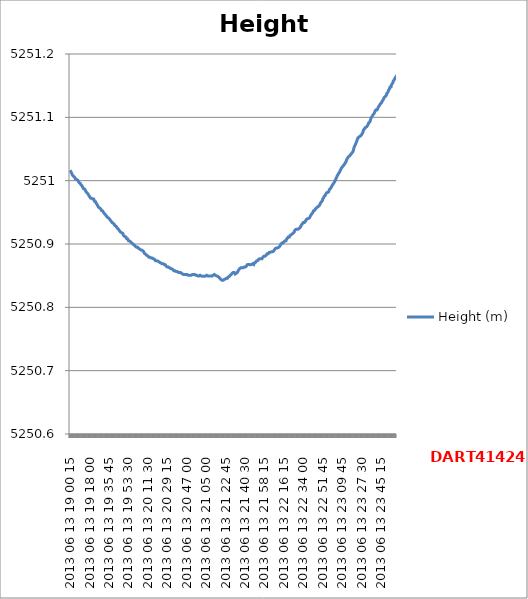
| Category | Height (m) |
|---|---|
| 2013 06 13 19 00 15 | 5251.017 |
| 2013 06 13 19 00 30 | 5251.016 |
| 2013 06 13 19 00 45 | 5251.015 |
| 2013 06 13 19 01 00 | 5251.014 |
| 2013 06 13 19 01 15 | 5251.014 |
| 2013 06 13 19 01 30 | 5251.012 |
| 2013 06 13 19 01 45 | 5251.012 |
| 2013 06 13 19 02 00 | 5251.011 |
| 2013 06 13 19 02 15 | 5251.011 |
| 2013 06 13 19 02 30 | 5251.009 |
| 2013 06 13 19 02 45 | 5251.009 |
| 2013 06 13 19 03 00 | 5251.008 |
| 2013 06 13 19 03 15 | 5251.008 |
| 2013 06 13 19 03 30 | 5251.007 |
| 2013 06 13 19 03 45 | 5251.007 |
| 2013 06 13 19 04 00 | 5251.006 |
| 2013 06 13 19 04 15 | 5251.006 |
| 2013 06 13 19 04 30 | 5251.005 |
| 2013 06 13 19 04 45 | 5251.004 |
| 2013 06 13 19 05 00 | 5251.004 |
| 2013 06 13 19 05 15 | 5251.003 |
| 2013 06 13 19 05 30 | 5251.003 |
| 2013 06 13 19 05 45 | 5251.003 |
| 2013 06 13 19 06 00 | 5251.002 |
| 2013 06 13 19 06 15 | 5251.002 |
| 2013 06 13 19 06 30 | 5251.001 |
| 2013 06 13 19 06 45 | 5251.001 |
| 2013 06 13 19 07 00 | 5251.001 |
| 2013 06 13 19 07 15 | 5251.001 |
| 2013 06 13 19 07 30 | 5251 |
| 2013 06 13 19 07 45 | 5250.999 |
| 2013 06 13 19 08 00 | 5250.999 |
| 2013 06 13 19 08 15 | 5250.998 |
| 2013 06 13 19 08 30 | 5250.997 |
| 2013 06 13 19 08 45 | 5250.997 |
| 2013 06 13 19 09 00 | 5250.996 |
| 2013 06 13 19 09 15 | 5250.996 |
| 2013 06 13 19 09 30 | 5250.996 |
| 2013 06 13 19 09 45 | 5250.995 |
| 2013 06 13 19 10 00 | 5250.994 |
| 2013 06 13 19 10 15 | 5250.993 |
| 2013 06 13 19 10 30 | 5250.993 |
| 2013 06 13 19 10 45 | 5250.993 |
| 2013 06 13 19 11 00 | 5250.992 |
| 2013 06 13 19 11 15 | 5250.991 |
| 2013 06 13 19 11 30 | 5250.99 |
| 2013 06 13 19 11 45 | 5250.99 |
| 2013 06 13 19 12 00 | 5250.99 |
| 2013 06 13 19 12 15 | 5250.99 |
| 2013 06 13 19 12 30 | 5250.988 |
| 2013 06 13 19 12 45 | 5250.988 |
| 2013 06 13 19 13 00 | 5250.988 |
| 2013 06 13 19 13 15 | 5250.987 |
| 2013 06 13 19 13 30 | 5250.987 |
| 2013 06 13 19 13 45 | 5250.986 |
| 2013 06 13 19 14 00 | 5250.986 |
| 2013 06 13 19 14 15 | 5250.985 |
| 2013 06 13 19 14 30 | 5250.984 |
| 2013 06 13 19 14 45 | 5250.983 |
| 2013 06 13 19 15 00 | 5250.983 |
| 2013 06 13 19 15 15 | 5250.983 |
| 2013 06 13 19 15 30 | 5250.982 |
| 2013 06 13 19 15 45 | 5250.981 |
| 2013 06 13 19 16 00 | 5250.98 |
| 2013 06 13 19 16 15 | 5250.98 |
| 2013 06 13 19 16 30 | 5250.98 |
| 2013 06 13 19 16 45 | 5250.979 |
| 2013 06 13 19 17 00 | 5250.978 |
| 2013 06 13 19 17 15 | 5250.977 |
| 2013 06 13 19 17 30 | 5250.976 |
| 2013 06 13 19 17 45 | 5250.976 |
| 2013 06 13 19 18 00 | 5250.975 |
| 2013 06 13 19 18 15 | 5250.975 |
| 2013 06 13 19 18 30 | 5250.974 |
| 2013 06 13 19 18 45 | 5250.973 |
| 2013 06 13 19 19 00 | 5250.974 |
| 2013 06 13 19 19 15 | 5250.973 |
| 2013 06 13 19 19 30 | 5250.973 |
| 2013 06 13 19 19 45 | 5250.972 |
| 2013 06 13 19 20 00 | 5250.971 |
| 2013 06 13 19 20 15 | 5250.972 |
| 2013 06 13 19 20 30 | 5250.971 |
| 2013 06 13 19 20 45 | 5250.971 |
| 2013 06 13 19 21 00 | 5250.971 |
| 2013 06 13 19 21 15 | 5250.97 |
| 2013 06 13 19 21 30 | 5250.97 |
| 2013 06 13 19 21 45 | 5250.971 |
| 2013 06 13 19 22 00 | 5250.97 |
| 2013 06 13 19 22 15 | 5250.969 |
| 2013 06 13 19 22 30 | 5250.968 |
| 2013 06 13 19 22 45 | 5250.968 |
| 2013 06 13 19 23 00 | 5250.968 |
| 2013 06 13 19 23 15 | 5250.967 |
| 2013 06 13 19 23 30 | 5250.967 |
| 2013 06 13 19 23 45 | 5250.966 |
| 2013 06 13 19 24 00 | 5250.965 |
| 2013 06 13 19 24 15 | 5250.964 |
| 2013 06 13 19 24 30 | 5250.964 |
| 2013 06 13 19 24 45 | 5250.963 |
| 2013 06 13 19 25 00 | 5250.963 |
| 2013 06 13 19 25 15 | 5250.961 |
| 2013 06 13 19 25 30 | 5250.961 |
| 2013 06 13 19 25 45 | 5250.96 |
| 2013 06 13 19 26 00 | 5250.96 |
| 2013 06 13 19 26 15 | 5250.958 |
| 2013 06 13 19 26 30 | 5250.959 |
| 2013 06 13 19 26 45 | 5250.958 |
| 2013 06 13 19 27 00 | 5250.957 |
| 2013 06 13 19 27 15 | 5250.957 |
| 2013 06 13 19 27 30 | 5250.957 |
| 2013 06 13 19 27 45 | 5250.956 |
| 2013 06 13 19 28 00 | 5250.956 |
| 2013 06 13 19 28 15 | 5250.955 |
| 2013 06 13 19 28 30 | 5250.955 |
| 2013 06 13 19 28 45 | 5250.954 |
| 2013 06 13 19 29 00 | 5250.953 |
| 2013 06 13 19 29 15 | 5250.952 |
| 2013 06 13 19 29 30 | 5250.952 |
| 2013 06 13 19 29 45 | 5250.952 |
| 2013 06 13 19 30 00 | 5250.952 |
| 2013 06 13 19 30 15 | 5250.951 |
| 2013 06 13 19 30 30 | 5250.951 |
| 2013 06 13 19 30 45 | 5250.95 |
| 2013 06 13 19 31 00 | 5250.95 |
| 2013 06 13 19 31 15 | 5250.95 |
| 2013 06 13 19 31 30 | 5250.948 |
| 2013 06 13 19 31 45 | 5250.949 |
| 2013 06 13 19 32 00 | 5250.948 |
| 2013 06 13 19 32 15 | 5250.948 |
| 2013 06 13 19 32 30 | 5250.947 |
| 2013 06 13 19 32 45 | 5250.947 |
| 2013 06 13 19 33 00 | 5250.946 |
| 2013 06 13 19 33 15 | 5250.945 |
| 2013 06 13 19 33 30 | 5250.945 |
| 2013 06 13 19 33 45 | 5250.944 |
| 2013 06 13 19 34 00 | 5250.943 |
| 2013 06 13 19 34 15 | 5250.943 |
| 2013 06 13 19 34 30 | 5250.943 |
| 2013 06 13 19 34 45 | 5250.942 |
| 2013 06 13 19 35 00 | 5250.942 |
| 2013 06 13 19 35 15 | 5250.942 |
| 2013 06 13 19 35 30 | 5250.941 |
| 2013 06 13 19 35 45 | 5250.941 |
| 2013 06 13 19 36 00 | 5250.94 |
| 2013 06 13 19 36 15 | 5250.939 |
| 2013 06 13 19 36 30 | 5250.939 |
| 2013 06 13 19 36 45 | 5250.939 |
| 2013 06 13 19 37 00 | 5250.938 |
| 2013 06 13 19 37 15 | 5250.937 |
| 2013 06 13 19 37 30 | 5250.937 |
| 2013 06 13 19 37 45 | 5250.936 |
| 2013 06 13 19 38 00 | 5250.935 |
| 2013 06 13 19 38 15 | 5250.935 |
| 2013 06 13 19 38 30 | 5250.934 |
| 2013 06 13 19 38 45 | 5250.934 |
| 2013 06 13 19 39 00 | 5250.934 |
| 2013 06 13 19 39 15 | 5250.933 |
| 2013 06 13 19 39 30 | 5250.933 |
| 2013 06 13 19 39 45 | 5250.932 |
| 2013 06 13 19 40 00 | 5250.932 |
| 2013 06 13 19 40 15 | 5250.932 |
| 2013 06 13 19 40 30 | 5250.931 |
| 2013 06 13 19 40 45 | 5250.931 |
| 2013 06 13 19 41 00 | 5250.93 |
| 2013 06 13 19 41 15 | 5250.929 |
| 2013 06 13 19 41 30 | 5250.929 |
| 2013 06 13 19 41 45 | 5250.929 |
| 2013 06 13 19 42 00 | 5250.929 |
| 2013 06 13 19 42 15 | 5250.928 |
| 2013 06 13 19 42 30 | 5250.928 |
| 2013 06 13 19 42 45 | 5250.927 |
| 2013 06 13 19 43 00 | 5250.927 |
| 2013 06 13 19 43 15 | 5250.926 |
| 2013 06 13 19 43 30 | 5250.926 |
| 2013 06 13 19 43 45 | 5250.925 |
| 2013 06 13 19 44 00 | 5250.925 |
| 2013 06 13 19 44 15 | 5250.924 |
| 2013 06 13 19 44 30 | 5250.923 |
| 2013 06 13 19 44 45 | 5250.923 |
| 2013 06 13 19 45 00 | 5250.922 |
| 2013 06 13 19 45 15 | 5250.922 |
| 2013 06 13 19 45 30 | 5250.921 |
| 2013 06 13 19 45 45 | 5250.921 |
| 2013 06 13 19 46 00 | 5250.92 |
| 2013 06 13 19 46 15 | 5250.919 |
| 2013 06 13 19 46 30 | 5250.919 |
| 2013 06 13 19 46 45 | 5250.919 |
| 2013 06 13 19 47 00 | 5250.918 |
| 2013 06 13 19 47 15 | 5250.918 |
| 2013 06 13 19 47 30 | 5250.917 |
| 2013 06 13 19 47 45 | 5250.917 |
| 2013 06 13 19 48 00 | 5250.917 |
| 2013 06 13 19 48 15 | 5250.917 |
| 2013 06 13 19 48 30 | 5250.916 |
| 2013 06 13 19 48 45 | 5250.915 |
| 2013 06 13 19 49 00 | 5250.914 |
| 2013 06 13 19 49 15 | 5250.913 |
| 2013 06 13 19 49 30 | 5250.914 |
| 2013 06 13 19 49 45 | 5250.913 |
| 2013 06 13 19 50 00 | 5250.913 |
| 2013 06 13 19 50 15 | 5250.912 |
| 2013 06 13 19 50 30 | 5250.912 |
| 2013 06 13 19 50 45 | 5250.911 |
| 2013 06 13 19 51 00 | 5250.911 |
| 2013 06 13 19 51 15 | 5250.911 |
| 2013 06 13 19 51 30 | 5250.911 |
| 2013 06 13 19 51 45 | 5250.909 |
| 2013 06 13 19 52 00 | 5250.91 |
| 2013 06 13 19 52 15 | 5250.908 |
| 2013 06 13 19 52 30 | 5250.909 |
| 2013 06 13 19 52 45 | 5250.908 |
| 2013 06 13 19 53 00 | 5250.907 |
| 2013 06 13 19 53 15 | 5250.907 |
| 2013 06 13 19 53 30 | 5250.906 |
| 2013 06 13 19 53 45 | 5250.906 |
| 2013 06 13 19 54 00 | 5250.906 |
| 2013 06 13 19 54 15 | 5250.905 |
| 2013 06 13 19 54 30 | 5250.905 |
| 2013 06 13 19 54 45 | 5250.904 |
| 2013 06 13 19 55 00 | 5250.904 |
| 2013 06 13 19 55 15 | 5250.904 |
| 2013 06 13 19 55 30 | 5250.904 |
| 2013 06 13 19 55 45 | 5250.903 |
| 2013 06 13 19 56 00 | 5250.903 |
| 2013 06 13 19 56 15 | 5250.903 |
| 2013 06 13 19 56 30 | 5250.902 |
| 2013 06 13 19 56 45 | 5250.902 |
| 2013 06 13 19 57 00 | 5250.901 |
| 2013 06 13 19 57 15 | 5250.901 |
| 2013 06 13 19 57 30 | 5250.901 |
| 2013 06 13 19 57 45 | 5250.9 |
| 2013 06 13 19 58 00 | 5250.9 |
| 2013 06 13 19 58 15 | 5250.899 |
| 2013 06 13 19 58 30 | 5250.899 |
| 2013 06 13 19 58 45 | 5250.898 |
| 2013 06 13 19 59 00 | 5250.898 |
| 2013 06 13 19 59 15 | 5250.898 |
| 2013 06 13 19 59 30 | 5250.898 |
| 2013 06 13 19 59 45 | 5250.897 |
| 2013 06 13 20 00 15 | 5250.896 |
| 2013 06 13 20 00 30 | 5250.896 |
| 2013 06 13 20 00 45 | 5250.895 |
| 2013 06 13 20 01 00 | 5250.896 |
| 2013 06 13 20 01 15 | 5250.895 |
| 2013 06 13 20 01 30 | 5250.895 |
| 2013 06 13 20 01 45 | 5250.895 |
| 2013 06 13 20 02 00 | 5250.895 |
| 2013 06 13 20 02 15 | 5250.895 |
| 2013 06 13 20 02 30 | 5250.895 |
| 2013 06 13 20 02 45 | 5250.895 |
| 2013 06 13 20 03 00 | 5250.894 |
| 2013 06 13 20 03 15 | 5250.893 |
| 2013 06 13 20 03 30 | 5250.893 |
| 2013 06 13 20 03 45 | 5250.893 |
| 2013 06 13 20 04 00 | 5250.893 |
| 2013 06 13 20 04 15 | 5250.892 |
| 2013 06 13 20 04 30 | 5250.892 |
| 2013 06 13 20 04 45 | 5250.892 |
| 2013 06 13 20 05 00 | 5250.892 |
| 2013 06 13 20 05 15 | 5250.891 |
| 2013 06 13 20 05 30 | 5250.891 |
| 2013 06 13 20 05 45 | 5250.891 |
| 2013 06 13 20 06 00 | 5250.89 |
| 2013 06 13 20 06 15 | 5250.89 |
| 2013 06 13 20 06 30 | 5250.89 |
| 2013 06 13 20 06 45 | 5250.889 |
| 2013 06 13 20 07 00 | 5250.889 |
| 2013 06 13 20 07 15 | 5250.889 |
| 2013 06 13 20 07 30 | 5250.888 |
| 2013 06 13 20 07 45 | 5250.887 |
| 2013 06 13 20 08 00 | 5250.887 |
| 2013 06 13 20 08 15 | 5250.887 |
| 2013 06 13 20 08 30 | 5250.886 |
| 2013 06 13 20 08 45 | 5250.885 |
| 2013 06 13 20 09 00 | 5250.885 |
| 2013 06 13 20 09 15 | 5250.884 |
| 2013 06 13 20 09 30 | 5250.885 |
| 2013 06 13 20 09 45 | 5250.884 |
| 2013 06 13 20 10 00 | 5250.884 |
| 2013 06 13 20 10 15 | 5250.883 |
| 2013 06 13 20 10 30 | 5250.883 |
| 2013 06 13 20 10 45 | 5250.882 |
| 2013 06 13 20 11 00 | 5250.882 |
| 2013 06 13 20 11 15 | 5250.881 |
| 2013 06 13 20 11 30 | 5250.881 |
| 2013 06 13 20 11 45 | 5250.881 |
| 2013 06 13 20 12 00 | 5250.88 |
| 2013 06 13 20 12 15 | 5250.88 |
| 2013 06 13 20 12 30 | 5250.879 |
| 2013 06 13 20 12 45 | 5250.88 |
| 2013 06 13 20 13 00 | 5250.88 |
| 2013 06 13 20 13 15 | 5250.879 |
| 2013 06 13 20 13 30 | 5250.879 |
| 2013 06 13 20 13 45 | 5250.878 |
| 2013 06 13 20 14 00 | 5250.878 |
| 2013 06 13 20 14 15 | 5250.878 |
| 2013 06 13 20 14 30 | 5250.878 |
| 2013 06 13 20 14 45 | 5250.878 |
| 2013 06 13 20 15 00 | 5250.878 |
| 2013 06 13 20 15 15 | 5250.878 |
| 2013 06 13 20 15 30 | 5250.878 |
| 2013 06 13 20 15 45 | 5250.877 |
| 2013 06 13 20 16 00 | 5250.878 |
| 2013 06 13 20 16 15 | 5250.877 |
| 2013 06 13 20 16 30 | 5250.877 |
| 2013 06 13 20 16 45 | 5250.877 |
| 2013 06 13 20 17 00 | 5250.877 |
| 2013 06 13 20 17 15 | 5250.877 |
| 2013 06 13 20 17 30 | 5250.876 |
| 2013 06 13 20 17 45 | 5250.876 |
| 2013 06 13 20 18 00 | 5250.875 |
| 2013 06 13 20 18 15 | 5250.875 |
| 2013 06 13 20 18 30 | 5250.874 |
| 2013 06 13 20 18 45 | 5250.874 |
| 2013 06 13 20 19 00 | 5250.874 |
| 2013 06 13 20 19 15 | 5250.873 |
| 2013 06 13 20 19 30 | 5250.874 |
| 2013 06 13 20 19 45 | 5250.874 |
| 2013 06 13 20 20 00 | 5250.873 |
| 2013 06 13 20 20 15 | 5250.873 |
| 2013 06 13 20 20 30 | 5250.873 |
| 2013 06 13 20 20 45 | 5250.873 |
| 2013 06 13 20 21 00 | 5250.873 |
| 2013 06 13 20 21 15 | 5250.873 |
| 2013 06 13 20 21 30 | 5250.872 |
| 2013 06 13 20 21 45 | 5250.872 |
| 2013 06 13 20 22 00 | 5250.872 |
| 2013 06 13 20 22 15 | 5250.871 |
| 2013 06 13 20 22 30 | 5250.871 |
| 2013 06 13 20 22 45 | 5250.87 |
| 2013 06 13 20 23 00 | 5250.871 |
| 2013 06 13 20 23 15 | 5250.87 |
| 2013 06 13 20 23 30 | 5250.87 |
| 2013 06 13 20 23 45 | 5250.869 |
| 2013 06 13 20 24 00 | 5250.869 |
| 2013 06 13 20 24 15 | 5250.869 |
| 2013 06 13 20 24 30 | 5250.869 |
| 2013 06 13 20 24 45 | 5250.869 |
| 2013 06 13 20 25 00 | 5250.869 |
| 2013 06 13 20 25 15 | 5250.868 |
| 2013 06 13 20 25 30 | 5250.869 |
| 2013 06 13 20 25 45 | 5250.868 |
| 2013 06 13 20 26 00 | 5250.868 |
| 2013 06 13 20 26 15 | 5250.868 |
| 2013 06 13 20 26 30 | 5250.868 |
| 2013 06 13 20 26 45 | 5250.867 |
| 2013 06 13 20 27 00 | 5250.867 |
| 2013 06 13 20 27 15 | 5250.867 |
| 2013 06 13 20 27 30 | 5250.867 |
| 2013 06 13 20 27 45 | 5250.866 |
| 2013 06 13 20 28 00 | 5250.866 |
| 2013 06 13 20 28 15 | 5250.865 |
| 2013 06 13 20 28 30 | 5250.865 |
| 2013 06 13 20 28 45 | 5250.864 |
| 2013 06 13 20 29 00 | 5250.864 |
| 2013 06 13 20 29 15 | 5250.864 |
| 2013 06 13 20 29 30 | 5250.864 |
| 2013 06 13 20 29 45 | 5250.864 |
| 2013 06 13 20 30 00 | 5250.864 |
| 2013 06 13 20 30 15 | 5250.864 |
| 2013 06 13 20 30 30 | 5250.863 |
| 2013 06 13 20 30 45 | 5250.863 |
| 2013 06 13 20 31 00 | 5250.863 |
| 2013 06 13 20 31 15 | 5250.863 |
| 2013 06 13 20 31 30 | 5250.862 |
| 2013 06 13 20 31 45 | 5250.862 |
| 2013 06 13 20 32 00 | 5250.862 |
| 2013 06 13 20 32 15 | 5250.862 |
| 2013 06 13 20 32 30 | 5250.862 |
| 2013 06 13 20 32 45 | 5250.861 |
| 2013 06 13 20 33 00 | 5250.861 |
| 2013 06 13 20 33 15 | 5250.861 |
| 2013 06 13 20 33 30 | 5250.861 |
| 2013 06 13 20 33 45 | 5250.86 |
| 2013 06 13 20 34 00 | 5250.86 |
| 2013 06 13 20 34 15 | 5250.86 |
| 2013 06 13 20 34 30 | 5250.859 |
| 2013 06 13 20 34 45 | 5250.859 |
| 2013 06 13 20 35 00 | 5250.859 |
| 2013 06 13 20 35 15 | 5250.858 |
| 2013 06 13 20 35 30 | 5250.859 |
| 2013 06 13 20 35 45 | 5250.858 |
| 2013 06 13 20 36 00 | 5250.858 |
| 2013 06 13 20 36 15 | 5250.858 |
| 2013 06 13 20 36 30 | 5250.858 |
| 2013 06 13 20 36 45 | 5250.858 |
| 2013 06 13 20 37 00 | 5250.858 |
| 2013 06 13 20 37 15 | 5250.857 |
| 2013 06 13 20 37 30 | 5250.857 |
| 2013 06 13 20 37 45 | 5250.858 |
| 2013 06 13 20 38 00 | 5250.857 |
| 2013 06 13 20 38 15 | 5250.857 |
| 2013 06 13 20 38 30 | 5250.857 |
| 2013 06 13 20 38 45 | 5250.856 |
| 2013 06 13 20 39 00 | 5250.857 |
| 2013 06 13 20 39 15 | 5250.856 |
| 2013 06 13 20 39 30 | 5250.856 |
| 2013 06 13 20 39 45 | 5250.855 |
| 2013 06 13 20 40 00 | 5250.855 |
| 2013 06 13 20 40 15 | 5250.855 |
| 2013 06 13 20 40 30 | 5250.855 |
| 2013 06 13 20 40 45 | 5250.855 |
| 2013 06 13 20 41 00 | 5250.855 |
| 2013 06 13 20 41 15 | 5250.855 |
| 2013 06 13 20 41 30 | 5250.855 |
| 2013 06 13 20 41 45 | 5250.854 |
| 2013 06 13 20 42 00 | 5250.854 |
| 2013 06 13 20 42 15 | 5250.854 |
| 2013 06 13 20 42 30 | 5250.854 |
| 2013 06 13 20 42 45 | 5250.854 |
| 2013 06 13 20 43 00 | 5250.854 |
| 2013 06 13 20 43 15 | 5250.853 |
| 2013 06 13 20 43 30 | 5250.853 |
| 2013 06 13 20 43 45 | 5250.852 |
| 2013 06 13 20 44 00 | 5250.853 |
| 2013 06 13 20 44 15 | 5250.852 |
| 2013 06 13 20 44 30 | 5250.852 |
| 2013 06 13 20 44 45 | 5250.852 |
| 2013 06 13 20 45 00 | 5250.852 |
| 2013 06 13 20 45 15 | 5250.852 |
| 2013 06 13 20 45 30 | 5250.852 |
| 2013 06 13 20 45 45 | 5250.852 |
| 2013 06 13 20 46 00 | 5250.852 |
| 2013 06 13 20 46 15 | 5250.852 |
| 2013 06 13 20 46 30 | 5250.852 |
| 2013 06 13 20 46 45 | 5250.852 |
| 2013 06 13 20 47 00 | 5250.852 |
| 2013 06 13 20 47 15 | 5250.852 |
| 2013 06 13 20 47 30 | 5250.851 |
| 2013 06 13 20 47 45 | 5250.851 |
| 2013 06 13 20 48 00 | 5250.851 |
| 2013 06 13 20 48 15 | 5250.851 |
| 2013 06 13 20 48 30 | 5250.851 |
| 2013 06 13 20 48 45 | 5250.852 |
| 2013 06 13 20 49 00 | 5250.851 |
| 2013 06 13 20 49 15 | 5250.851 |
| 2013 06 13 20 49 30 | 5250.851 |
| 2013 06 13 20 49 45 | 5250.851 |
| 2013 06 13 20 50 00 | 5250.851 |
| 2013 06 13 20 50 15 | 5250.851 |
| 2013 06 13 20 50 30 | 5250.851 |
| 2013 06 13 20 50 45 | 5250.851 |
| 2013 06 13 20 51 00 | 5250.851 |
| 2013 06 13 20 51 15 | 5250.851 |
| 2013 06 13 20 51 30 | 5250.852 |
| 2013 06 13 20 51 45 | 5250.852 |
| 2013 06 13 20 52 00 | 5250.852 |
| 2013 06 13 20 52 15 | 5250.852 |
| 2013 06 13 20 52 30 | 5250.852 |
| 2013 06 13 20 52 45 | 5250.852 |
| 2013 06 13 20 53 00 | 5250.852 |
| 2013 06 13 20 53 15 | 5250.852 |
| 2013 06 13 20 53 30 | 5250.852 |
| 2013 06 13 20 53 45 | 5250.852 |
| 2013 06 13 20 54 00 | 5250.852 |
| 2013 06 13 20 54 15 | 5250.852 |
| 2013 06 13 20 54 30 | 5250.852 |
| 2013 06 13 20 54 45 | 5250.852 |
| 2013 06 13 20 55 00 | 5250.852 |
| 2013 06 13 20 55 15 | 5250.851 |
| 2013 06 13 20 55 30 | 5250.851 |
| 2013 06 13 20 55 45 | 5250.851 |
| 2013 06 13 20 56 00 | 5250.851 |
| 2013 06 13 20 56 15 | 5250.851 |
| 2013 06 13 20 56 30 | 5250.851 |
| 2013 06 13 20 56 45 | 5250.851 |
| 2013 06 13 20 57 00 | 5250.85 |
| 2013 06 13 20 57 15 | 5250.85 |
| 2013 06 13 20 57 30 | 5250.85 |
| 2013 06 13 20 57 45 | 5250.85 |
| 2013 06 13 20 58 00 | 5250.85 |
| 2013 06 13 20 58 15 | 5250.85 |
| 2013 06 13 20 58 30 | 5250.85 |
| 2013 06 13 20 58 45 | 5250.85 |
| 2013 06 13 20 59 00 | 5250.85 |
| 2013 06 13 20 59 15 | 5250.851 |
| 2013 06 13 20 59 30 | 5250.851 |
| 2013 06 13 20 59 45 | 5250.85 |
| 2013 06 13 21 00 15 | 5250.85 |
| 2013 06 13 21 00 30 | 5250.85 |
| 2013 06 13 21 00 45 | 5250.85 |
| 2013 06 13 21 01 00 | 5250.849 |
| 2013 06 13 21 01 15 | 5250.849 |
| 2013 06 13 21 01 30 | 5250.849 |
| 2013 06 13 21 01 45 | 5250.849 |
| 2013 06 13 21 02 00 | 5250.848 |
| 2013 06 13 21 02 15 | 5250.849 |
| 2013 06 13 21 02 30 | 5250.849 |
| 2013 06 13 21 02 45 | 5250.849 |
| 2013 06 13 21 03 00 | 5250.848 |
| 2013 06 13 21 03 15 | 5250.849 |
| 2013 06 13 21 03 30 | 5250.849 |
| 2013 06 13 21 03 45 | 5250.849 |
| 2013 06 13 21 04 00 | 5250.849 |
| 2013 06 13 21 04 15 | 5250.85 |
| 2013 06 13 21 04 30 | 5250.85 |
| 2013 06 13 21 04 45 | 5250.85 |
| 2013 06 13 21 05 00 | 5250.85 |
| 2013 06 13 21 05 15 | 5250.85 |
| 2013 06 13 21 05 30 | 5250.851 |
| 2013 06 13 21 05 45 | 5250.85 |
| 2013 06 13 21 06 00 | 5250.85 |
| 2013 06 13 21 06 15 | 5250.85 |
| 2013 06 13 21 06 30 | 5250.85 |
| 2013 06 13 21 06 45 | 5250.849 |
| 2013 06 13 21 07 00 | 5250.85 |
| 2013 06 13 21 07 15 | 5250.85 |
| 2013 06 13 21 07 30 | 5250.85 |
| 2013 06 13 21 07 45 | 5250.85 |
| 2013 06 13 21 08 00 | 5250.85 |
| 2013 06 13 21 08 15 | 5250.85 |
| 2013 06 13 21 08 30 | 5250.85 |
| 2013 06 13 21 08 45 | 5250.85 |
| 2013 06 13 21 09 00 | 5250.85 |
| 2013 06 13 21 09 15 | 5250.85 |
| 2013 06 13 21 09 30 | 5250.85 |
| 2013 06 13 21 09 45 | 5250.85 |
| 2013 06 13 21 10 00 | 5250.85 |
| 2013 06 13 21 10 15 | 5250.85 |
| 2013 06 13 21 10 30 | 5250.85 |
| 2013 06 13 21 10 45 | 5250.85 |
| 2013 06 13 21 11 00 | 5250.85 |
| 2013 06 13 21 11 15 | 5250.851 |
| 2013 06 13 21 11 30 | 5250.851 |
| 2013 06 13 21 11 45 | 5250.851 |
| 2013 06 13 21 12 00 | 5250.852 |
| 2013 06 13 21 12 15 | 5250.852 |
| 2013 06 13 21 12 30 | 5250.852 |
| 2013 06 13 21 12 45 | 5250.851 |
| 2013 06 13 21 13 00 | 5250.851 |
| 2013 06 13 21 13 15 | 5250.851 |
| 2013 06 13 21 13 30 | 5250.851 |
| 2013 06 13 21 13 45 | 5250.851 |
| 2013 06 13 21 14 00 | 5250.851 |
| 2013 06 13 21 14 15 | 5250.851 |
| 2013 06 13 21 14 30 | 5250.85 |
| 2013 06 13 21 14 45 | 5250.85 |
| 2013 06 13 21 15 00 | 5250.85 |
| 2013 06 13 21 15 15 | 5250.849 |
| 2013 06 13 21 15 30 | 5250.849 |
| 2013 06 13 21 15 45 | 5250.849 |
| 2013 06 13 21 16 00 | 5250.849 |
| 2013 06 13 21 16 15 | 5250.849 |
| 2013 06 13 21 16 30 | 5250.848 |
| 2013 06 13 21 16 45 | 5250.848 |
| 2013 06 13 21 17 00 | 5250.848 |
| 2013 06 13 21 17 15 | 5250.847 |
| 2013 06 13 21 17 30 | 5250.846 |
| 2013 06 13 21 17 45 | 5250.846 |
| 2013 06 13 21 18 00 | 5250.845 |
| 2013 06 13 21 18 15 | 5250.845 |
| 2013 06 13 21 18 30 | 5250.844 |
| 2013 06 13 21 18 45 | 5250.844 |
| 2013 06 13 21 19 00 | 5250.843 |
| 2013 06 13 21 19 15 | 5250.844 |
| 2013 06 13 21 19 30 | 5250.843 |
| 2013 06 13 21 19 45 | 5250.843 |
| 2013 06 13 21 20 00 | 5250.844 |
| 2013 06 13 21 20 15 | 5250.843 |
| 2013 06 13 21 20 30 | 5250.843 |
| 2013 06 13 21 20 45 | 5250.844 |
| 2013 06 13 21 21 00 | 5250.843 |
| 2013 06 13 21 21 15 | 5250.844 |
| 2013 06 13 21 21 30 | 5250.844 |
| 2013 06 13 21 21 45 | 5250.844 |
| 2013 06 13 21 22 00 | 5250.845 |
| 2013 06 13 21 22 15 | 5250.844 |
| 2013 06 13 21 22 30 | 5250.845 |
| 2013 06 13 21 22 45 | 5250.845 |
| 2013 06 13 21 23 00 | 5250.845 |
| 2013 06 13 21 23 15 | 5250.845 |
| 2013 06 13 21 23 30 | 5250.846 |
| 2013 06 13 21 23 45 | 5250.845 |
| 2013 06 13 21 24 00 | 5250.847 |
| 2013 06 13 21 24 15 | 5250.846 |
| 2013 06 13 21 24 30 | 5250.846 |
| 2013 06 13 21 24 45 | 5250.847 |
| 2013 06 13 21 25 00 | 5250.847 |
| 2013 06 13 21 25 15 | 5250.848 |
| 2013 06 13 21 25 30 | 5250.848 |
| 2013 06 13 21 25 45 | 5250.849 |
| 2013 06 13 21 26 00 | 5250.849 |
| 2013 06 13 21 26 15 | 5250.849 |
| 2013 06 13 21 26 30 | 5250.85 |
| 2013 06 13 21 26 45 | 5250.85 |
| 2013 06 13 21 27 00 | 5250.851 |
| 2013 06 13 21 27 15 | 5250.851 |
| 2013 06 13 21 27 30 | 5250.852 |
| 2013 06 13 21 27 45 | 5250.852 |
| 2013 06 13 21 28 00 | 5250.852 |
| 2013 06 13 21 28 15 | 5250.852 |
| 2013 06 13 21 28 30 | 5250.853 |
| 2013 06 13 21 28 45 | 5250.854 |
| 2013 06 13 21 29 00 | 5250.855 |
| 2013 06 13 21 29 15 | 5250.855 |
| 2013 06 13 21 29 30 | 5250.855 |
| 2013 06 13 21 29 45 | 5250.855 |
| 2013 06 13 21 30 00 | 5250.855 |
| 2013 06 13 21 30 15 | 5250.855 |
| 2013 06 13 21 30 30 | 5250.855 |
| 2013 06 13 21 30 45 | 5250.855 |
| 2013 06 13 21 31 00 | 5250.854 |
| 2013 06 13 21 31 15 | 5250.854 |
| 2013 06 13 21 31 30 | 5250.853 |
| 2013 06 13 21 31 45 | 5250.853 |
| 2013 06 13 21 32 00 | 5250.852 |
| 2013 06 13 21 32 15 | 5250.853 |
| 2013 06 13 21 32 30 | 5250.854 |
| 2013 06 13 21 32 45 | 5250.854 |
| 2013 06 13 21 33 00 | 5250.855 |
| 2013 06 13 21 33 15 | 5250.855 |
| 2013 06 13 21 33 30 | 5250.855 |
| 2013 06 13 21 33 45 | 5250.856 |
| 2013 06 13 21 34 00 | 5250.856 |
| 2013 06 13 21 34 15 | 5250.858 |
| 2013 06 13 21 34 30 | 5250.858 |
| 2013 06 13 21 34 45 | 5250.859 |
| 2013 06 13 21 35 00 | 5250.86 |
| 2013 06 13 21 35 15 | 5250.861 |
| 2013 06 13 21 35 30 | 5250.861 |
| 2013 06 13 21 35 45 | 5250.862 |
| 2013 06 13 21 36 00 | 5250.862 |
| 2013 06 13 21 36 15 | 5250.863 |
| 2013 06 13 21 36 30 | 5250.863 |
| 2013 06 13 21 36 45 | 5250.863 |
| 2013 06 13 21 37 00 | 5250.863 |
| 2013 06 13 21 37 15 | 5250.863 |
| 2013 06 13 21 37 30 | 5250.863 |
| 2013 06 13 21 37 45 | 5250.863 |
| 2013 06 13 21 38 00 | 5250.863 |
| 2013 06 13 21 38 15 | 5250.863 |
| 2013 06 13 21 38 30 | 5250.863 |
| 2013 06 13 21 38 45 | 5250.863 |
| 2013 06 13 21 39 00 | 5250.864 |
| 2013 06 13 21 39 15 | 5250.864 |
| 2013 06 13 21 39 30 | 5250.864 |
| 2013 06 13 21 39 45 | 5250.864 |
| 2013 06 13 21 40 00 | 5250.864 |
| 2013 06 13 21 40 15 | 5250.865 |
| 2013 06 13 21 40 30 | 5250.865 |
| 2013 06 13 21 40 45 | 5250.864 |
| 2013 06 13 21 41 00 | 5250.865 |
| 2013 06 13 21 41 15 | 5250.865 |
| 2013 06 13 21 41 30 | 5250.865 |
| 2013 06 13 21 41 45 | 5250.865 |
| 2013 06 13 21 42 00 | 5250.866 |
| 2013 06 13 21 42 15 | 5250.866 |
| 2013 06 13 21 42 30 | 5250.867 |
| 2013 06 13 21 42 45 | 5250.867 |
| 2013 06 13 21 43 00 | 5250.868 |
| 2013 06 13 21 43 15 | 5250.868 |
| 2013 06 13 21 43 30 | 5250.868 |
| 2013 06 13 21 43 45 | 5250.868 |
| 2013 06 13 21 44 00 | 5250.868 |
| 2013 06 13 21 44 15 | 5250.867 |
| 2013 06 13 21 44 30 | 5250.868 |
| 2013 06 13 21 44 45 | 5250.868 |
| 2013 06 13 21 45 00 | 5250.868 |
| 2013 06 13 21 45 15 | 5250.867 |
| 2013 06 13 21 45 30 | 5250.867 |
| 2013 06 13 21 45 45 | 5250.868 |
| 2013 06 13 21 46 00 | 5250.868 |
| 2013 06 13 21 46 15 | 5250.868 |
| 2013 06 13 21 46 30 | 5250.868 |
| 2013 06 13 21 46 45 | 5250.869 |
| 2013 06 13 21 47 00 | 5250.869 |
| 2013 06 13 21 47 15 | 5250.869 |
| 2013 06 13 21 47 30 | 5250.869 |
| 2013 06 13 21 47 45 | 5250.869 |
| 2013 06 13 21 48 00 | 5250.869 |
| 2013 06 13 21 48 15 | 5250.869 |
| 2013 06 13 21 48 30 | 5250.868 |
| 2013 06 13 21 48 45 | 5250.869 |
| 2013 06 13 21 49 00 | 5250.87 |
| 2013 06 13 21 49 15 | 5250.869 |
| 2013 06 13 21 49 30 | 5250.871 |
| 2013 06 13 21 49 45 | 5250.87 |
| 2013 06 13 21 50 00 | 5250.871 |
| 2013 06 13 21 50 15 | 5250.871 |
| 2013 06 13 21 50 30 | 5250.872 |
| 2013 06 13 21 50 45 | 5250.872 |
| 2013 06 13 21 51 00 | 5250.873 |
| 2013 06 13 21 51 15 | 5250.873 |
| 2013 06 13 21 51 30 | 5250.873 |
| 2013 06 13 21 51 45 | 5250.873 |
| 2013 06 13 21 52 00 | 5250.874 |
| 2013 06 13 21 52 15 | 5250.874 |
| 2013 06 13 21 52 30 | 5250.874 |
| 2013 06 13 21 52 45 | 5250.874 |
| 2013 06 13 21 53 00 | 5250.876 |
| 2013 06 13 21 53 15 | 5250.876 |
| 2013 06 13 21 53 30 | 5250.876 |
| 2013 06 13 21 53 45 | 5250.877 |
| 2013 06 13 21 54 00 | 5250.877 |
| 2013 06 13 21 54 15 | 5250.877 |
| 2013 06 13 21 54 30 | 5250.877 |
| 2013 06 13 21 54 45 | 5250.878 |
| 2013 06 13 21 55 00 | 5250.877 |
| 2013 06 13 21 55 15 | 5250.877 |
| 2013 06 13 21 55 30 | 5250.877 |
| 2013 06 13 21 55 45 | 5250.877 |
| 2013 06 13 21 56 00 | 5250.877 |
| 2013 06 13 21 56 15 | 5250.878 |
| 2013 06 13 21 56 30 | 5250.878 |
| 2013 06 13 21 56 45 | 5250.879 |
| 2013 06 13 21 57 00 | 5250.879 |
| 2013 06 13 21 57 15 | 5250.88 |
| 2013 06 13 21 57 30 | 5250.88 |
| 2013 06 13 21 57 45 | 5250.881 |
| 2013 06 13 21 58 00 | 5250.88 |
| 2013 06 13 21 58 15 | 5250.881 |
| 2013 06 13 21 58 30 | 5250.881 |
| 2013 06 13 21 58 45 | 5250.881 |
| 2013 06 13 21 59 00 | 5250.881 |
| 2013 06 13 21 59 15 | 5250.882 |
| 2013 06 13 21 59 30 | 5250.882 |
| 2013 06 13 21 59 45 | 5250.883 |
| 2013 06 13 22 00 15 | 5250.883 |
| 2013 06 13 22 00 30 | 5250.884 |
| 2013 06 13 22 00 45 | 5250.883 |
| 2013 06 13 22 01 00 | 5250.885 |
| 2013 06 13 22 01 15 | 5250.884 |
| 2013 06 13 22 01 30 | 5250.885 |
| 2013 06 13 22 01 45 | 5250.885 |
| 2013 06 13 22 02 00 | 5250.885 |
| 2013 06 13 22 02 15 | 5250.886 |
| 2013 06 13 22 02 30 | 5250.886 |
| 2013 06 13 22 02 45 | 5250.886 |
| 2013 06 13 22 03 00 | 5250.887 |
| 2013 06 13 22 03 15 | 5250.888 |
| 2013 06 13 22 03 30 | 5250.888 |
| 2013 06 13 22 03 45 | 5250.887 |
| 2013 06 13 22 04 00 | 5250.887 |
| 2013 06 13 22 04 15 | 5250.888 |
| 2013 06 13 22 04 30 | 5250.888 |
| 2013 06 13 22 04 45 | 5250.888 |
| 2013 06 13 22 05 00 | 5250.888 |
| 2013 06 13 22 05 15 | 5250.888 |
| 2013 06 13 22 05 30 | 5250.888 |
| 2013 06 13 22 05 45 | 5250.888 |
| 2013 06 13 22 06 00 | 5250.888 |
| 2013 06 13 22 06 15 | 5250.888 |
| 2013 06 13 22 06 30 | 5250.888 |
| 2013 06 13 22 06 45 | 5250.888 |
| 2013 06 13 22 07 00 | 5250.889 |
| 2013 06 13 22 07 15 | 5250.89 |
| 2013 06 13 22 07 30 | 5250.891 |
| 2013 06 13 22 07 45 | 5250.891 |
| 2013 06 13 22 08 00 | 5250.891 |
| 2013 06 13 22 08 15 | 5250.892 |
| 2013 06 13 22 08 30 | 5250.893 |
| 2013 06 13 22 08 45 | 5250.893 |
| 2013 06 13 22 09 00 | 5250.893 |
| 2013 06 13 22 09 15 | 5250.893 |
| 2013 06 13 22 09 30 | 5250.894 |
| 2013 06 13 22 09 45 | 5250.894 |
| 2013 06 13 22 10 00 | 5250.894 |
| 2013 06 13 22 10 15 | 5250.893 |
| 2013 06 13 22 10 30 | 5250.894 |
| 2013 06 13 22 10 45 | 5250.894 |
| 2013 06 13 22 11 00 | 5250.894 |
| 2013 06 13 22 11 15 | 5250.894 |
| 2013 06 13 22 11 30 | 5250.895 |
| 2013 06 13 22 11 45 | 5250.895 |
| 2013 06 13 22 12 00 | 5250.895 |
| 2013 06 13 22 12 15 | 5250.896 |
| 2013 06 13 22 12 30 | 5250.897 |
| 2013 06 13 22 12 45 | 5250.898 |
| 2013 06 13 22 13 00 | 5250.898 |
| 2013 06 13 22 13 15 | 5250.898 |
| 2013 06 13 22 13 30 | 5250.9 |
| 2013 06 13 22 13 45 | 5250.901 |
| 2013 06 13 22 14 00 | 5250.901 |
| 2013 06 13 22 14 15 | 5250.901 |
| 2013 06 13 22 14 30 | 5250.902 |
| 2013 06 13 22 14 45 | 5250.902 |
| 2013 06 13 22 15 00 | 5250.902 |
| 2013 06 13 22 15 15 | 5250.902 |
| 2013 06 13 22 15 30 | 5250.902 |
| 2013 06 13 22 15 45 | 5250.903 |
| 2013 06 13 22 16 00 | 5250.903 |
| 2013 06 13 22 16 15 | 5250.904 |
| 2013 06 13 22 16 30 | 5250.904 |
| 2013 06 13 22 16 45 | 5250.905 |
| 2013 06 13 22 17 00 | 5250.905 |
| 2013 06 13 22 17 15 | 5250.905 |
| 2013 06 13 22 17 30 | 5250.905 |
| 2013 06 13 22 17 45 | 5250.906 |
| 2013 06 13 22 18 00 | 5250.906 |
| 2013 06 13 22 18 15 | 5250.906 |
| 2013 06 13 22 18 30 | 5250.907 |
| 2013 06 13 22 18 45 | 5250.907 |
| 2013 06 13 22 19 00 | 5250.908 |
| 2013 06 13 22 19 15 | 5250.909 |
| 2013 06 13 22 19 30 | 5250.909 |
| 2013 06 13 22 19 45 | 5250.91 |
| 2013 06 13 22 20 00 | 5250.91 |
| 2013 06 13 22 20 15 | 5250.911 |
| 2013 06 13 22 20 30 | 5250.911 |
| 2013 06 13 22 20 45 | 5250.911 |
| 2013 06 13 22 21 00 | 5250.911 |
| 2013 06 13 22 21 15 | 5250.911 |
| 2013 06 13 22 21 30 | 5250.912 |
| 2013 06 13 22 21 45 | 5250.913 |
| 2013 06 13 22 22 00 | 5250.913 |
| 2013 06 13 22 22 15 | 5250.913 |
| 2013 06 13 22 22 30 | 5250.914 |
| 2013 06 13 22 22 45 | 5250.915 |
| 2013 06 13 22 23 00 | 5250.915 |
| 2013 06 13 22 23 15 | 5250.915 |
| 2013 06 13 22 23 30 | 5250.916 |
| 2013 06 13 22 23 45 | 5250.916 |
| 2013 06 13 22 24 00 | 5250.916 |
| 2013 06 13 22 24 15 | 5250.916 |
| 2013 06 13 22 24 30 | 5250.916 |
| 2013 06 13 22 24 45 | 5250.917 |
| 2013 06 13 22 25 00 | 5250.917 |
| 2013 06 13 22 25 15 | 5250.918 |
| 2013 06 13 22 25 30 | 5250.918 |
| 2013 06 13 22 25 45 | 5250.919 |
| 2013 06 13 22 26 00 | 5250.921 |
| 2013 06 13 22 26 15 | 5250.921 |
| 2013 06 13 22 26 30 | 5250.922 |
| 2013 06 13 22 26 45 | 5250.922 |
| 2013 06 13 22 27 00 | 5250.923 |
| 2013 06 13 22 27 15 | 5250.923 |
| 2013 06 13 22 27 30 | 5250.923 |
| 2013 06 13 22 27 45 | 5250.923 |
| 2013 06 13 22 28 00 | 5250.924 |
| 2013 06 13 22 28 15 | 5250.923 |
| 2013 06 13 22 28 30 | 5250.924 |
| 2013 06 13 22 28 45 | 5250.924 |
| 2013 06 13 22 29 00 | 5250.924 |
| 2013 06 13 22 29 15 | 5250.924 |
| 2013 06 13 22 29 30 | 5250.924 |
| 2013 06 13 22 29 45 | 5250.924 |
| 2013 06 13 22 30 00 | 5250.925 |
| 2013 06 13 22 30 15 | 5250.924 |
| 2013 06 13 22 30 30 | 5250.925 |
| 2013 06 13 22 30 45 | 5250.926 |
| 2013 06 13 22 31 00 | 5250.926 |
| 2013 06 13 22 31 15 | 5250.926 |
| 2013 06 13 22 31 30 | 5250.927 |
| 2013 06 13 22 31 45 | 5250.928 |
| 2013 06 13 22 32 00 | 5250.929 |
| 2013 06 13 22 32 15 | 5250.93 |
| 2013 06 13 22 32 30 | 5250.93 |
| 2013 06 13 22 32 45 | 5250.931 |
| 2013 06 13 22 33 00 | 5250.932 |
| 2013 06 13 22 33 15 | 5250.932 |
| 2013 06 13 22 33 30 | 5250.932 |
| 2013 06 13 22 33 45 | 5250.933 |
| 2013 06 13 22 34 00 | 5250.934 |
| 2013 06 13 22 34 15 | 5250.933 |
| 2013 06 13 22 34 30 | 5250.934 |
| 2013 06 13 22 34 45 | 5250.935 |
| 2013 06 13 22 35 00 | 5250.934 |
| 2013 06 13 22 35 15 | 5250.935 |
| 2013 06 13 22 35 30 | 5250.935 |
| 2013 06 13 22 35 45 | 5250.935 |
| 2013 06 13 22 36 00 | 5250.936 |
| 2013 06 13 22 36 15 | 5250.936 |
| 2013 06 13 22 36 30 | 5250.937 |
| 2013 06 13 22 36 45 | 5250.939 |
| 2013 06 13 22 37 00 | 5250.939 |
| 2013 06 13 22 37 15 | 5250.939 |
| 2013 06 13 22 37 30 | 5250.94 |
| 2013 06 13 22 37 45 | 5250.94 |
| 2013 06 13 22 38 00 | 5250.94 |
| 2013 06 13 22 38 15 | 5250.941 |
| 2013 06 13 22 38 30 | 5250.941 |
| 2013 06 13 22 38 45 | 5250.941 |
| 2013 06 13 22 39 00 | 5250.941 |
| 2013 06 13 22 39 15 | 5250.941 |
| 2013 06 13 22 39 30 | 5250.942 |
| 2013 06 13 22 39 45 | 5250.942 |
| 2013 06 13 22 40 00 | 5250.943 |
| 2013 06 13 22 40 15 | 5250.944 |
| 2013 06 13 22 40 30 | 5250.945 |
| 2013 06 13 22 40 45 | 5250.945 |
| 2013 06 13 22 41 00 | 5250.946 |
| 2013 06 13 22 41 15 | 5250.947 |
| 2013 06 13 22 41 30 | 5250.947 |
| 2013 06 13 22 41 45 | 5250.947 |
| 2013 06 13 22 42 00 | 5250.948 |
| 2013 06 13 22 42 15 | 5250.949 |
| 2013 06 13 22 42 30 | 5250.949 |
| 2013 06 13 22 42 45 | 5250.95 |
| 2013 06 13 22 43 00 | 5250.95 |
| 2013 06 13 22 43 15 | 5250.952 |
| 2013 06 13 22 43 30 | 5250.952 |
| 2013 06 13 22 43 45 | 5250.953 |
| 2013 06 13 22 44 00 | 5250.953 |
| 2013 06 13 22 44 15 | 5250.953 |
| 2013 06 13 22 44 30 | 5250.954 |
| 2013 06 13 22 44 45 | 5250.954 |
| 2013 06 13 22 45 00 | 5250.955 |
| 2013 06 13 22 45 15 | 5250.956 |
| 2013 06 13 22 45 30 | 5250.956 |
| 2013 06 13 22 45 45 | 5250.956 |
| 2013 06 13 22 46 00 | 5250.957 |
| 2013 06 13 22 46 15 | 5250.958 |
| 2013 06 13 22 46 30 | 5250.958 |
| 2013 06 13 22 46 45 | 5250.958 |
| 2013 06 13 22 47 00 | 5250.959 |
| 2013 06 13 22 47 15 | 5250.96 |
| 2013 06 13 22 47 30 | 5250.96 |
| 2013 06 13 22 47 45 | 5250.96 |
| 2013 06 13 22 48 00 | 5250.96 |
| 2013 06 13 22 48 15 | 5250.961 |
| 2013 06 13 22 48 30 | 5250.961 |
| 2013 06 13 22 48 45 | 5250.961 |
| 2013 06 13 22 49 00 | 5250.962 |
| 2013 06 13 22 49 15 | 5250.963 |
| 2013 06 13 22 49 30 | 5250.964 |
| 2013 06 13 22 49 45 | 5250.965 |
| 2013 06 13 22 50 00 | 5250.966 |
| 2013 06 13 22 50 15 | 5250.966 |
| 2013 06 13 22 50 30 | 5250.966 |
| 2013 06 13 22 50 45 | 5250.967 |
| 2013 06 13 22 51 00 | 5250.968 |
| 2013 06 13 22 51 15 | 5250.968 |
| 2013 06 13 22 51 30 | 5250.969 |
| 2013 06 13 22 51 45 | 5250.971 |
| 2013 06 13 22 52 00 | 5250.971 |
| 2013 06 13 22 52 15 | 5250.972 |
| 2013 06 13 22 52 30 | 5250.973 |
| 2013 06 13 22 52 45 | 5250.974 |
| 2013 06 13 22 53 00 | 5250.975 |
| 2013 06 13 22 53 15 | 5250.975 |
| 2013 06 13 22 53 30 | 5250.976 |
| 2013 06 13 22 53 45 | 5250.976 |
| 2013 06 13 22 54 00 | 5250.977 |
| 2013 06 13 22 54 15 | 5250.978 |
| 2013 06 13 22 54 30 | 5250.979 |
| 2013 06 13 22 54 45 | 5250.979 |
| 2013 06 13 22 55 00 | 5250.98 |
| 2013 06 13 22 55 15 | 5250.981 |
| 2013 06 13 22 55 30 | 5250.981 |
| 2013 06 13 22 55 45 | 5250.982 |
| 2013 06 13 22 56 00 | 5250.982 |
| 2013 06 13 22 56 15 | 5250.982 |
| 2013 06 13 22 56 30 | 5250.983 |
| 2013 06 13 22 56 45 | 5250.983 |
| 2013 06 13 22 57 00 | 5250.983 |
| 2013 06 13 22 57 15 | 5250.983 |
| 2013 06 13 22 57 30 | 5250.985 |
| 2013 06 13 22 57 45 | 5250.985 |
| 2013 06 13 22 58 00 | 5250.986 |
| 2013 06 13 22 58 15 | 5250.987 |
| 2013 06 13 22 58 30 | 5250.987 |
| 2013 06 13 22 58 45 | 5250.988 |
| 2013 06 13 22 59 00 | 5250.988 |
| 2013 06 13 22 59 15 | 5250.989 |
| 2013 06 13 22 59 30 | 5250.989 |
| 2013 06 13 22 59 45 | 5250.99 |
| 2013 06 13 23 00 15 | 5250.991 |
| 2013 06 13 23 00 30 | 5250.992 |
| 2013 06 13 23 00 45 | 5250.992 |
| 2013 06 13 23 01 00 | 5250.993 |
| 2013 06 13 23 01 15 | 5250.994 |
| 2013 06 13 23 01 30 | 5250.994 |
| 2013 06 13 23 01 45 | 5250.995 |
| 2013 06 13 23 02 00 | 5250.996 |
| 2013 06 13 23 02 15 | 5250.997 |
| 2013 06 13 23 02 30 | 5250.997 |
| 2013 06 13 23 02 45 | 5250.998 |
| 2013 06 13 23 03 00 | 5250.999 |
| 2013 06 13 23 03 15 | 5250.999 |
| 2013 06 13 23 03 30 | 5251.001 |
| 2013 06 13 23 03 45 | 5251.001 |
| 2013 06 13 23 04 00 | 5251.003 |
| 2013 06 13 23 04 15 | 5251.003 |
| 2013 06 13 23 04 30 | 5251.004 |
| 2013 06 13 23 04 45 | 5251.006 |
| 2013 06 13 23 05 00 | 5251.006 |
| 2013 06 13 23 05 15 | 5251.008 |
| 2013 06 13 23 05 30 | 5251.008 |
| 2013 06 13 23 05 45 | 5251.009 |
| 2013 06 13 23 06 00 | 5251.01 |
| 2013 06 13 23 06 15 | 5251.01 |
| 2013 06 13 23 06 30 | 5251.011 |
| 2013 06 13 23 06 45 | 5251.012 |
| 2013 06 13 23 07 00 | 5251.013 |
| 2013 06 13 23 07 15 | 5251.013 |
| 2013 06 13 23 07 30 | 5251.014 |
| 2013 06 13 23 07 45 | 5251.015 |
| 2013 06 13 23 08 00 | 5251.016 |
| 2013 06 13 23 08 15 | 5251.017 |
| 2013 06 13 23 08 30 | 5251.018 |
| 2013 06 13 23 08 45 | 5251.019 |
| 2013 06 13 23 09 00 | 5251.02 |
| 2013 06 13 23 09 15 | 5251.02 |
| 2013 06 13 23 09 30 | 5251.021 |
| 2013 06 13 23 09 45 | 5251.021 |
| 2013 06 13 23 10 00 | 5251.022 |
| 2013 06 13 23 10 15 | 5251.022 |
| 2013 06 13 23 10 30 | 5251.023 |
| 2013 06 13 23 10 45 | 5251.024 |
| 2013 06 13 23 11 00 | 5251.024 |
| 2013 06 13 23 11 15 | 5251.024 |
| 2013 06 13 23 11 30 | 5251.025 |
| 2013 06 13 23 11 45 | 5251.026 |
| 2013 06 13 23 12 00 | 5251.027 |
| 2013 06 13 23 12 15 | 5251.027 |
| 2013 06 13 23 12 30 | 5251.028 |
| 2013 06 13 23 12 45 | 5251.029 |
| 2013 06 13 23 13 00 | 5251.029 |
| 2013 06 13 23 13 15 | 5251.03 |
| 2013 06 13 23 13 30 | 5251.032 |
| 2013 06 13 23 13 45 | 5251.032 |
| 2013 06 13 23 14 00 | 5251.033 |
| 2013 06 13 23 14 15 | 5251.034 |
| 2013 06 13 23 14 30 | 5251.035 |
| 2013 06 13 23 14 45 | 5251.036 |
| 2013 06 13 23 15 00 | 5251.036 |
| 2013 06 13 23 15 15 | 5251.037 |
| 2013 06 13 23 15 30 | 5251.038 |
| 2013 06 13 23 15 45 | 5251.038 |
| 2013 06 13 23 16 00 | 5251.038 |
| 2013 06 13 23 16 15 | 5251.039 |
| 2013 06 13 23 16 30 | 5251.039 |
| 2013 06 13 23 16 45 | 5251.04 |
| 2013 06 13 23 17 00 | 5251.04 |
| 2013 06 13 23 17 15 | 5251.041 |
| 2013 06 13 23 17 30 | 5251.041 |
| 2013 06 13 23 17 45 | 5251.041 |
| 2013 06 13 23 18 00 | 5251.042 |
| 2013 06 13 23 18 15 | 5251.043 |
| 2013 06 13 23 18 30 | 5251.043 |
| 2013 06 13 23 18 45 | 5251.044 |
| 2013 06 13 23 19 00 | 5251.044 |
| 2013 06 13 23 19 15 | 5251.045 |
| 2013 06 13 23 19 30 | 5251.046 |
| 2013 06 13 23 19 45 | 5251.047 |
| 2013 06 13 23 20 00 | 5251.048 |
| 2013 06 13 23 20 15 | 5251.05 |
| 2013 06 13 23 20 30 | 5251.052 |
| 2013 06 13 23 20 45 | 5251.052 |
| 2013 06 13 23 21 00 | 5251.054 |
| 2013 06 13 23 21 15 | 5251.055 |
| 2013 06 13 23 21 30 | 5251.056 |
| 2013 06 13 23 21 45 | 5251.057 |
| 2013 06 13 23 22 00 | 5251.058 |
| 2013 06 13 23 22 15 | 5251.059 |
| 2013 06 13 23 22 30 | 5251.06 |
| 2013 06 13 23 22 45 | 5251.061 |
| 2013 06 13 23 23 00 | 5251.062 |
| 2013 06 13 23 23 15 | 5251.064 |
| 2013 06 13 23 23 30 | 5251.065 |
| 2013 06 13 23 23 45 | 5251.066 |
| 2013 06 13 23 24 00 | 5251.066 |
| 2013 06 13 23 24 15 | 5251.068 |
| 2013 06 13 23 24 30 | 5251.068 |
| 2013 06 13 23 24 45 | 5251.069 |
| 2013 06 13 23 25 00 | 5251.069 |
| 2013 06 13 23 25 15 | 5251.069 |
| 2013 06 13 23 25 30 | 5251.07 |
| 2013 06 13 23 25 45 | 5251.07 |
| 2013 06 13 23 26 00 | 5251.07 |
| 2013 06 13 23 26 15 | 5251.071 |
| 2013 06 13 23 26 30 | 5251.071 |
| 2013 06 13 23 26 45 | 5251.072 |
| 2013 06 13 23 27 00 | 5251.072 |
| 2013 06 13 23 27 15 | 5251.072 |
| 2013 06 13 23 27 30 | 5251.072 |
| 2013 06 13 23 27 45 | 5251.073 |
| 2013 06 13 23 28 00 | 5251.074 |
| 2013 06 13 23 28 15 | 5251.075 |
| 2013 06 13 23 28 30 | 5251.076 |
| 2013 06 13 23 28 45 | 5251.077 |
| 2013 06 13 23 29 00 | 5251.078 |
| 2013 06 13 23 29 15 | 5251.08 |
| 2013 06 13 23 29 30 | 5251.081 |
| 2013 06 13 23 29 45 | 5251.081 |
| 2013 06 13 23 30 00 | 5251.082 |
| 2013 06 13 23 30 15 | 5251.082 |
| 2013 06 13 23 30 30 | 5251.083 |
| 2013 06 13 23 30 45 | 5251.083 |
| 2013 06 13 23 31 00 | 5251.084 |
| 2013 06 13 23 31 15 | 5251.085 |
| 2013 06 13 23 31 30 | 5251.085 |
| 2013 06 13 23 31 45 | 5251.085 |
| 2013 06 13 23 32 00 | 5251.085 |
| 2013 06 13 23 32 15 | 5251.085 |
| 2013 06 13 23 32 30 | 5251.085 |
| 2013 06 13 23 32 45 | 5251.086 |
| 2013 06 13 23 33 00 | 5251.087 |
| 2013 06 13 23 33 15 | 5251.088 |
| 2013 06 13 23 33 30 | 5251.089 |
| 2013 06 13 23 33 45 | 5251.09 |
| 2013 06 13 23 34 00 | 5251.092 |
| 2013 06 13 23 34 15 | 5251.092 |
| 2013 06 13 23 34 30 | 5251.093 |
| 2013 06 13 23 34 45 | 5251.093 |
| 2013 06 13 23 35 00 | 5251.093 |
| 2013 06 13 23 35 15 | 5251.094 |
| 2013 06 13 23 35 30 | 5251.095 |
| 2013 06 13 23 35 45 | 5251.096 |
| 2013 06 13 23 36 00 | 5251.098 |
| 2013 06 13 23 36 15 | 5251.099 |
| 2013 06 13 23 36 30 | 5251.1 |
| 2013 06 13 23 36 45 | 5251.101 |
| 2013 06 13 23 37 00 | 5251.101 |
| 2013 06 13 23 37 15 | 5251.102 |
| 2013 06 13 23 37 30 | 5251.102 |
| 2013 06 13 23 37 45 | 5251.102 |
| 2013 06 13 23 38 00 | 5251.104 |
| 2013 06 13 23 38 15 | 5251.104 |
| 2013 06 13 23 38 30 | 5251.105 |
| 2013 06 13 23 38 45 | 5251.106 |
| 2013 06 13 23 39 00 | 5251.107 |
| 2013 06 13 23 39 15 | 5251.108 |
| 2013 06 13 23 39 30 | 5251.109 |
| 2013 06 13 23 39 45 | 5251.11 |
| 2013 06 13 23 40 00 | 5251.111 |
| 2013 06 13 23 40 15 | 5251.111 |
| 2013 06 13 23 40 30 | 5251.112 |
| 2013 06 13 23 40 45 | 5251.112 |
| 2013 06 13 23 41 00 | 5251.111 |
| 2013 06 13 23 41 15 | 5251.112 |
| 2013 06 13 23 41 30 | 5251.112 |
| 2013 06 13 23 41 45 | 5251.113 |
| 2013 06 13 23 42 00 | 5251.113 |
| 2013 06 13 23 42 15 | 5251.114 |
| 2013 06 13 23 42 30 | 5251.115 |
| 2013 06 13 23 42 45 | 5251.115 |
| 2013 06 13 23 43 00 | 5251.117 |
| 2013 06 13 23 43 15 | 5251.117 |
| 2013 06 13 23 43 30 | 5251.118 |
| 2013 06 13 23 43 45 | 5251.118 |
| 2013 06 13 23 44 00 | 5251.119 |
| 2013 06 13 23 44 15 | 5251.12 |
| 2013 06 13 23 44 30 | 5251.121 |
| 2013 06 13 23 44 45 | 5251.121 |
| 2013 06 13 23 45 00 | 5251.121 |
| 2013 06 13 23 45 15 | 5251.122 |
| 2013 06 13 23 45 30 | 5251.123 |
| 2013 06 13 23 45 45 | 5251.123 |
| 2013 06 13 23 46 00 | 5251.124 |
| 2013 06 13 23 46 15 | 5251.125 |
| 2013 06 13 23 46 30 | 5251.126 |
| 2013 06 13 23 46 45 | 5251.127 |
| 2013 06 13 23 47 00 | 5251.127 |
| 2013 06 13 23 47 15 | 5251.128 |
| 2013 06 13 23 47 30 | 5251.129 |
| 2013 06 13 23 47 45 | 5251.13 |
| 2013 06 13 23 48 00 | 5251.131 |
| 2013 06 13 23 48 15 | 5251.132 |
| 2013 06 13 23 48 30 | 5251.132 |
| 2013 06 13 23 48 45 | 5251.132 |
| 2013 06 13 23 49 00 | 5251.133 |
| 2013 06 13 23 49 15 | 5251.133 |
| 2013 06 13 23 49 30 | 5251.134 |
| 2013 06 13 23 49 45 | 5251.134 |
| 2013 06 13 23 50 00 | 5251.135 |
| 2013 06 13 23 50 15 | 5251.136 |
| 2013 06 13 23 50 30 | 5251.137 |
| 2013 06 13 23 50 45 | 5251.138 |
| 2013 06 13 23 51 00 | 5251.138 |
| 2013 06 13 23 51 15 | 5251.139 |
| 2013 06 13 23 51 30 | 5251.14 |
| 2013 06 13 23 51 45 | 5251.141 |
| 2013 06 13 23 52 00 | 5251.142 |
| 2013 06 13 23 52 15 | 5251.143 |
| 2013 06 13 23 52 30 | 5251.144 |
| 2013 06 13 23 52 45 | 5251.145 |
| 2013 06 13 23 53 00 | 5251.145 |
| 2013 06 13 23 53 15 | 5251.146 |
| 2013 06 13 23 53 30 | 5251.148 |
| 2013 06 13 23 53 45 | 5251.148 |
| 2013 06 13 23 54 00 | 5251.148 |
| 2013 06 13 23 54 15 | 5251.149 |
| 2013 06 13 23 54 30 | 5251.149 |
| 2013 06 13 23 54 45 | 5251.151 |
| 2013 06 13 23 55 00 | 5251.151 |
| 2013 06 13 23 55 15 | 5251.153 |
| 2013 06 13 23 55 30 | 5251.154 |
| 2013 06 13 23 55 45 | 5251.154 |
| 2013 06 13 23 56 00 | 5251.155 |
| 2013 06 13 23 56 15 | 5251.155 |
| 2013 06 13 23 56 30 | 5251.157 |
| 2013 06 13 23 56 45 | 5251.157 |
| 2013 06 13 23 57 00 | 5251.158 |
| 2013 06 13 23 57 15 | 5251.159 |
| 2013 06 13 23 57 30 | 5251.16 |
| 2013 06 13 23 57 45 | 5251.161 |
| 2013 06 13 23 58 00 | 5251.162 |
| 2013 06 13 23 58 15 | 5251.162 |
| 2013 06 13 23 58 30 | 5251.163 |
| 2013 06 13 23 58 45 | 5251.164 |
| 2013 06 13 23 59 00 | 5251.164 |
| 2013 06 13 23 59 15 | 5251.165 |
| 2013 06 13 23 59 30 | 5251.165 |
| 2013 06 13 23 59 45 | 5251.167 |